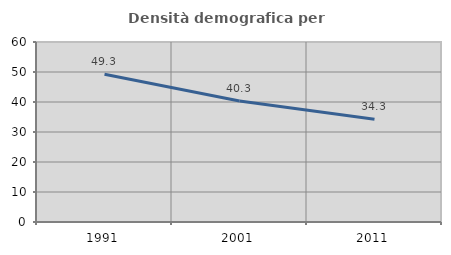
| Category | Densità demografica |
|---|---|
| 1991.0 | 49.279 |
| 2001.0 | 40.305 |
| 2011.0 | 34.27 |